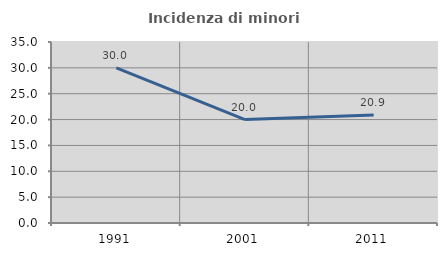
| Category | Incidenza di minori stranieri |
|---|---|
| 1991.0 | 30 |
| 2001.0 | 20 |
| 2011.0 | 20.87 |